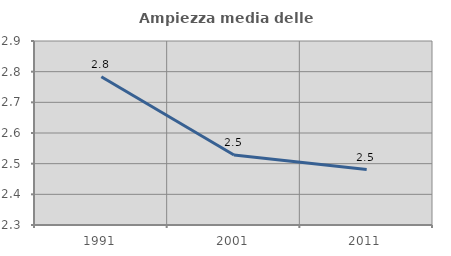
| Category | Ampiezza media delle famiglie |
|---|---|
| 1991.0 | 2.784 |
| 2001.0 | 2.528 |
| 2011.0 | 2.481 |